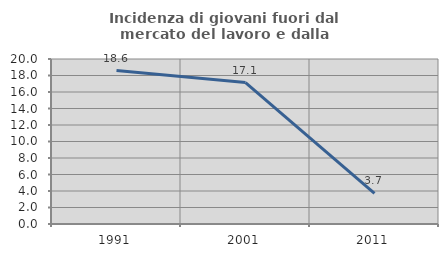
| Category | Incidenza di giovani fuori dal mercato del lavoro e dalla formazione  |
|---|---|
| 1991.0 | 18.605 |
| 2001.0 | 17.143 |
| 2011.0 | 3.704 |